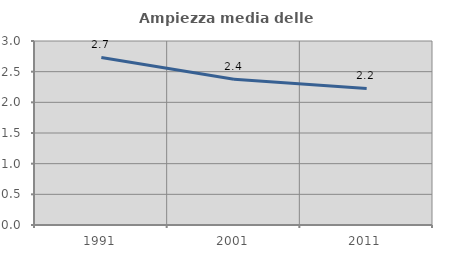
| Category | Ampiezza media delle famiglie |
|---|---|
| 1991.0 | 2.731 |
| 2001.0 | 2.375 |
| 2011.0 | 2.226 |